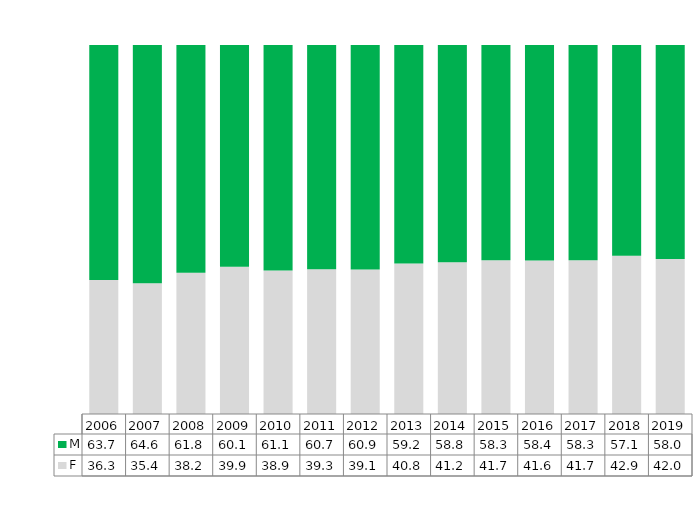
| Category | F | M |
|---|---|---|
| 2006.0 | 0.363 | 0.637 |
| 2007.0 | 0.354 | 0.646 |
| 2008.0 | 0.382 | 0.618 |
| 2009.0 | 0.399 | 0.601 |
| 2010.0 | 0.389 | 0.611 |
| 2011.0 | 0.393 | 0.607 |
| 2012.0 | 0.391 | 0.609 |
| 2013.0 | 0.408 | 0.592 |
| 2014.0 | 0.412 | 0.588 |
| 2015.0 | 0.417 | 0.583 |
| 2016.0 | 0.416 | 0.584 |
| 2017.0 | 0.417 | 0.583 |
| 2018.0 | 0.429 | 0.571 |
| 2019.0 | 0.42 | 0.58 |